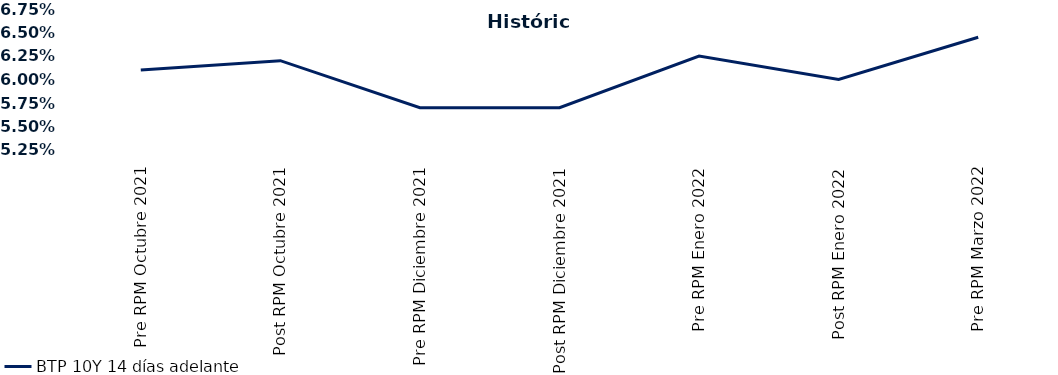
| Category | BTP 10Y 14 días adelante |
|---|---|
| Pre RPM Octubre 2021 | 0.061 |
| Post RPM Octubre 2021 | 0.062 |
| Pre RPM Diciembre 2021 | 0.057 |
| Post RPM Diciembre 2021 | 0.057 |
| Pre RPM Enero 2022 | 0.062 |
| Post RPM Enero 2022 | 0.06 |
| Pre RPM Marzo 2022 | 0.064 |